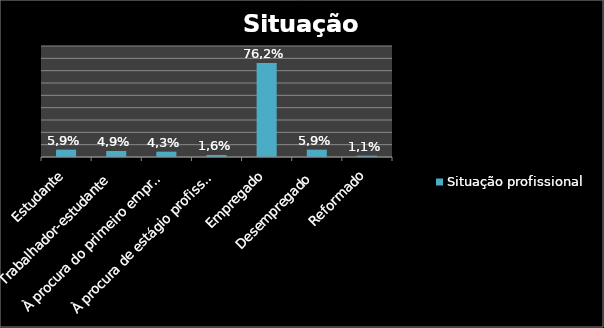
| Category | Situação profissional |
|---|---|
| Estudante | 5.946 |
| Trabalhador-estudante | 4.865 |
| À procura do primeiro emprego | 4.324 |
| À procura de estágio profissional | 1.622 |
| Empregado | 76.216 |
| Desempregado | 5.946 |
| Reformado | 1.081 |